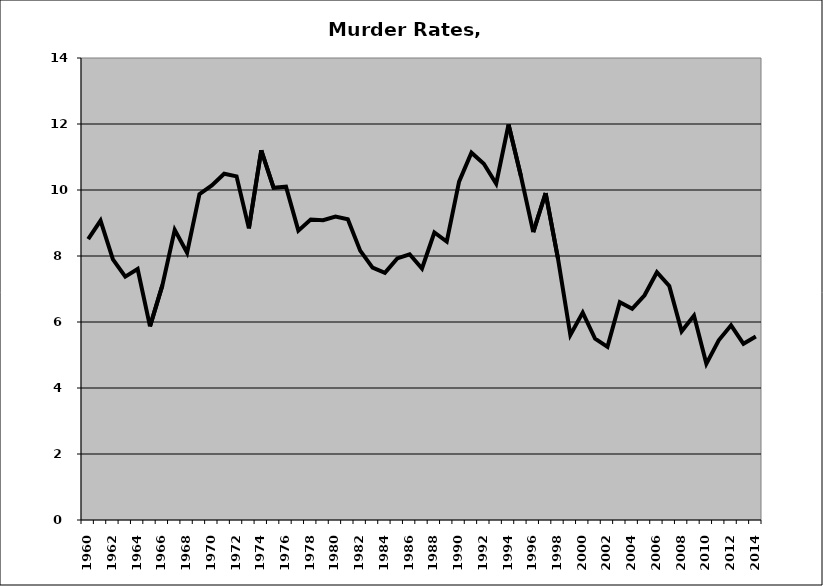
| Category | Murder |
|---|---|
| 1960.0 | 8.509 |
| 1961.0 | 9.071 |
| 1962.0 | 7.899 |
| 1963.0 | 7.374 |
| 1964.0 | 7.605 |
| 1965.0 | 5.867 |
| 1966.0 | 7.11 |
| 1967.0 | 8.791 |
| 1968.0 | 8.101 |
| 1969.0 | 9.875 |
| 1970.0 | 10.139 |
| 1971.0 | 10.494 |
| 1972.0 | 10.415 |
| 1973.0 | 8.837 |
| 1974.0 | 11.203 |
| 1975.0 | 10.066 |
| 1976.0 | 10.1 |
| 1977.0 | 8.769 |
| 1978.0 | 9.103 |
| 1979.0 | 9.083 |
| 1980.0 | 9.194 |
| 1981.0 | 9.111 |
| 1982.0 | 8.162 |
| 1983.0 | 7.646 |
| 1984.0 | 7.493 |
| 1985.0 | 7.927 |
| 1986.0 | 8.052 |
| 1987.0 | 7.621 |
| 1988.0 | 8.712 |
| 1989.0 | 8.437 |
| 1990.0 | 10.252 |
| 1991.0 | 11.13 |
| 1992.0 | 10.796 |
| 1993.0 | 10.19 |
| 1994.0 | 11.985 |
| 1995.0 | 10.427 |
| 1996.0 | 8.725 |
| 1997.0 | 9.909 |
| 1998.0 | 7.92 |
| 1999.0 | 5.605 |
| 2000.0 | 6.284 |
| 2001.0 | 5.492 |
| 2002.0 | 5.247 |
| 2003.0 | 6.599 |
| 2004.0 | 6.4 |
| 2005.0 | 6.809 |
| 2006.0 | 7.507 |
| 2007.0 | 7.09 |
| 2008.0 | 5.719 |
| 2009.0 | 6.195 |
| 2010.0 | 4.733 |
| 2011.0 | 5.445 |
| 2012.0 | 5.899 |
| 2013.0 | 5.34 |
| 2014.0 | 5.562 |